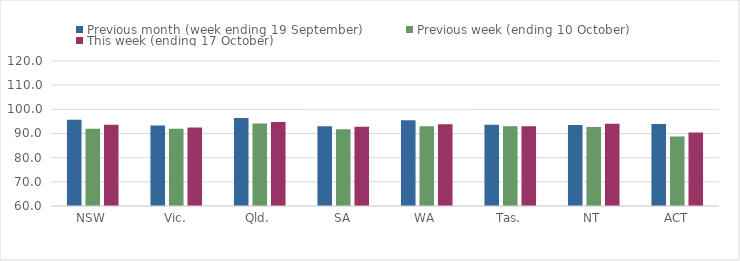
| Category | Previous month (week ending 19 September) | Previous week (ending 10 October) | This week (ending 17 October) |
|---|---|---|---|
| NSW | 95.64 | 91.97 | 93.64 |
| Vic. | 93.28 | 91.98 | 92.47 |
| Qld. | 96.4 | 94.12 | 94.74 |
| SA | 93.04 | 91.74 | 92.78 |
| WA | 95.49 | 92.96 | 93.78 |
| Tas. | 93.64 | 93.03 | 93.03 |
| NT | 93.48 | 92.68 | 94.03 |
| ACT | 93.96 | 88.78 | 90.42 |